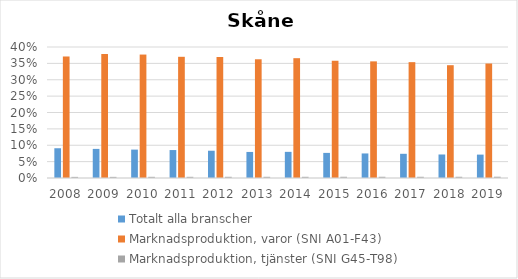
| Category | Totalt alla branscher | Marknadsproduktion, varor (SNI A01-F43) | Marknadsproduktion, tjänster (SNI G45-T98) |
|---|---|---|---|
| 2008.0 | 0.091 | 0.371 | 0.003 |
| 2009.0 | 0.089 | 0.379 | 0.003 |
| 2010.0 | 0.087 | 0.377 | 0.004 |
| 2011.0 | 0.085 | 0.37 | 0.004 |
| 2012.0 | 0.083 | 0.369 | 0.004 |
| 2013.0 | 0.08 | 0.363 | 0.004 |
| 2014.0 | 0.08 | 0.366 | 0.004 |
| 2015.0 | 0.077 | 0.358 | 0.004 |
| 2016.0 | 0.075 | 0.356 | 0.004 |
| 2017.0 | 0.074 | 0.354 | 0.004 |
| 2018.0 | 0.072 | 0.344 | 0.004 |
| 2019.0 | 0.071 | 0.35 | 0.004 |